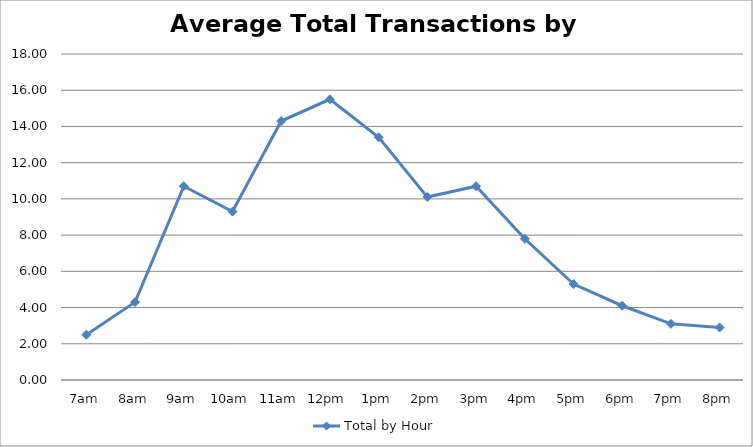
| Category | Total by Hour |
|---|---|
| 7am | 2.5 |
| 8am | 4.3 |
| 9am | 10.7 |
| 10am | 9.3 |
| 11am | 14.3 |
| 12pm | 15.5 |
| 1pm | 13.4 |
| 2pm | 10.1 |
| 3pm | 10.7 |
| 4pm | 7.8 |
| 5pm | 5.3 |
| 6pm | 4.1 |
| 7pm | 3.1 |
| 8pm | 2.9 |